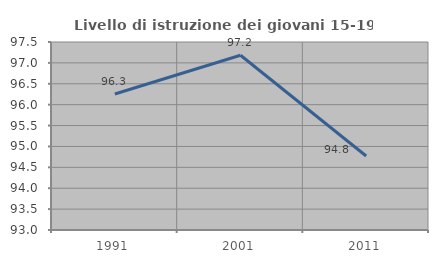
| Category | Livello di istruzione dei giovani 15-19 anni |
|---|---|
| 1991.0 | 96.257 |
| 2001.0 | 97.183 |
| 2011.0 | 94.771 |